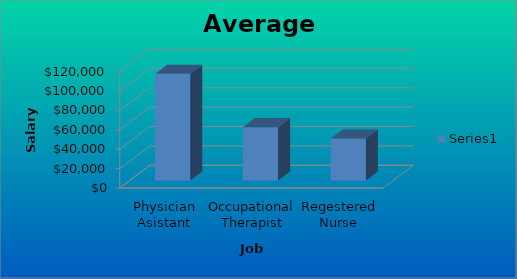
| Category | Series 0 |
|---|---|
| Physician Asistant | 110240 |
| Occupational Therapist | 55090 |
| Regestered Nurse | 43410 |